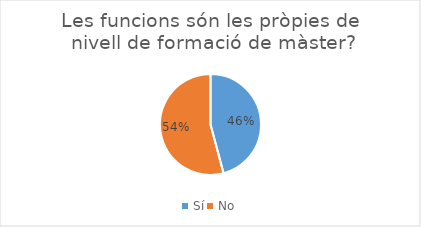
| Category | Series 0 |
|---|---|
| Sí | 33 |
| No | 39 |